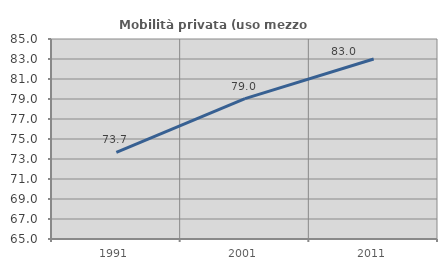
| Category | Mobilità privata (uso mezzo privato) |
|---|---|
| 1991.0 | 73.667 |
| 2001.0 | 79.035 |
| 2011.0 | 83.004 |